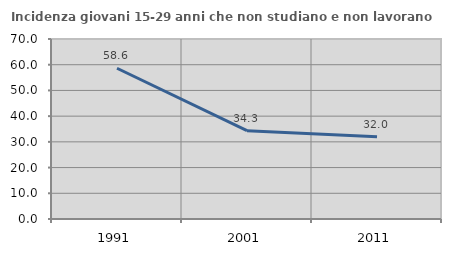
| Category | Incidenza giovani 15-29 anni che non studiano e non lavorano  |
|---|---|
| 1991.0 | 58.621 |
| 2001.0 | 34.345 |
| 2011.0 | 32.029 |